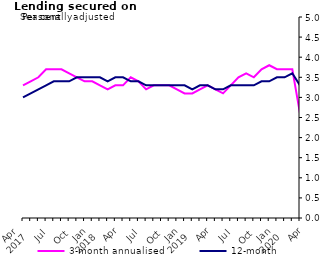
| Category | 3-month annualised | 12-month |
|---|---|---|
| Apr 
2017 | 3.3 | 3 |
|  | 3.4 | 3.1 |
|  | 3.5 | 3.2 |
| Jul | 3.7 | 3.3 |
|  | 3.7 | 3.4 |
|  | 3.7 | 3.4 |
| Oct | 3.6 | 3.4 |
|  | 3.5 | 3.5 |
|  | 3.4 | 3.5 |
| Jan 
2018 | 3.4 | 3.5 |
|  | 3.3 | 3.5 |
|  | 3.2 | 3.4 |
| Apr | 3.3 | 3.5 |
|  | 3.3 | 3.5 |
|  | 3.5 | 3.4 |
| Jul | 3.4 | 3.4 |
|  | 3.2 | 3.3 |
|  | 3.3 | 3.3 |
| Oct | 3.3 | 3.3 |
|  | 3.3 | 3.3 |
|  | 3.2 | 3.3 |
| Jan 
2019 | 3.1 | 3.3 |
|  | 3.1 | 3.2 |
|  | 3.2 | 3.3 |
| Apr | 3.3 | 3.3 |
|  | 3.2 | 3.2 |
|  | 3.1 | 3.2 |
| Jul | 3.3 | 3.3 |
|  | 3.5 | 3.3 |
|  | 3.6 | 3.3 |
| Oct | 3.5 | 3.3 |
|  | 3.7 | 3.4 |
|  | 3.8 | 3.4 |
| Jan 
2020 | 3.7 | 3.5 |
|  | 3.7 | 3.5 |
|  | 3.7 | 3.6 |
| Apr | 2.6 | 3.3 |